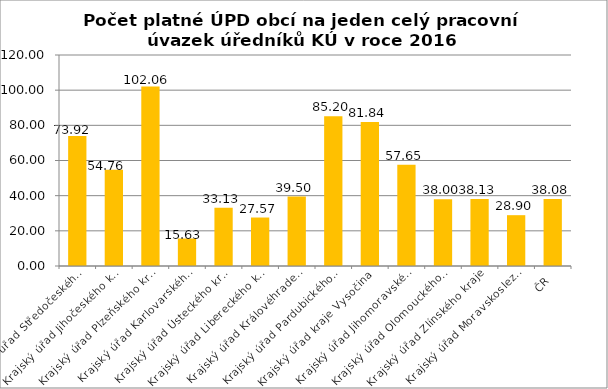
| Category | Počet platné ÚPD obcí na jeden celý pracovní úvazek úředníků KÚ |
|---|---|
| Krajský úřad Středočeského kraje | 73.92 |
| Krajský úřad Jihočeského kraje | 54.76 |
| Krajský úřad Plzeňského kraje | 102.06 |
| Krajský úřad Karlovarského kraje | 15.63 |
| Krajský úřad Ústeckého kraje | 33.13 |
| Krajský úřad Libereckého kraje | 27.57 |
| Krajský úřad Královéhradeckého kraje | 39.5 |
| Krajský úřad Pardubického kraje | 85.2 |
| Krajský úřad kraje Vysočina | 81.84 |
| Krajský úřad Jihomoravského kraje | 57.65 |
| Krajský úřad Olomouckého kraje | 38 |
| Krajský úřad Zlínského kraje | 38.13 |
| Krajský úřad Moravskoslezského kraje | 28.9 |
| ČR | 38.08 |